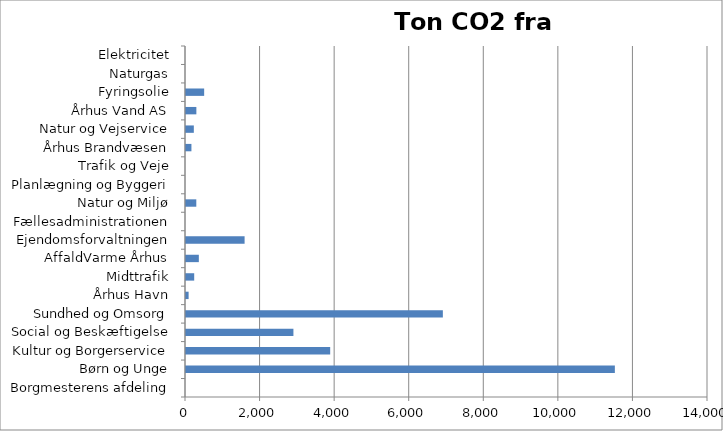
| Category | Ton CO2 |
|---|---|
| Borgmesterens afdeling | 0 |
| Børn og Unge | 11502 |
| Kultur og Borgerservice | 3867 |
| Social og Beskæftigelse | 2881 |
| Sundhed og Omsorg | 6889 |
| Århus Havn | 70.138 |
| Midttrafik | 219.892 |
| AffaldVarme Århus | 344.266 |
| Ejendomsforvaltningen | 1571.507 |
| Fællesadministrationen | 0 |
| Natur og Miljø | 276.351 |
| Planlægning og Byggeri | 0 |
| Trafik og Veje | 0 |
| Århus Brandvæsen | 145.603 |
| Natur og Vejservice | 209.844 |
| Århus Vand AS | 278 |
| Fyringsolie | 487.064 |
| Naturgas | 0 |
| Elektricitet | 0 |